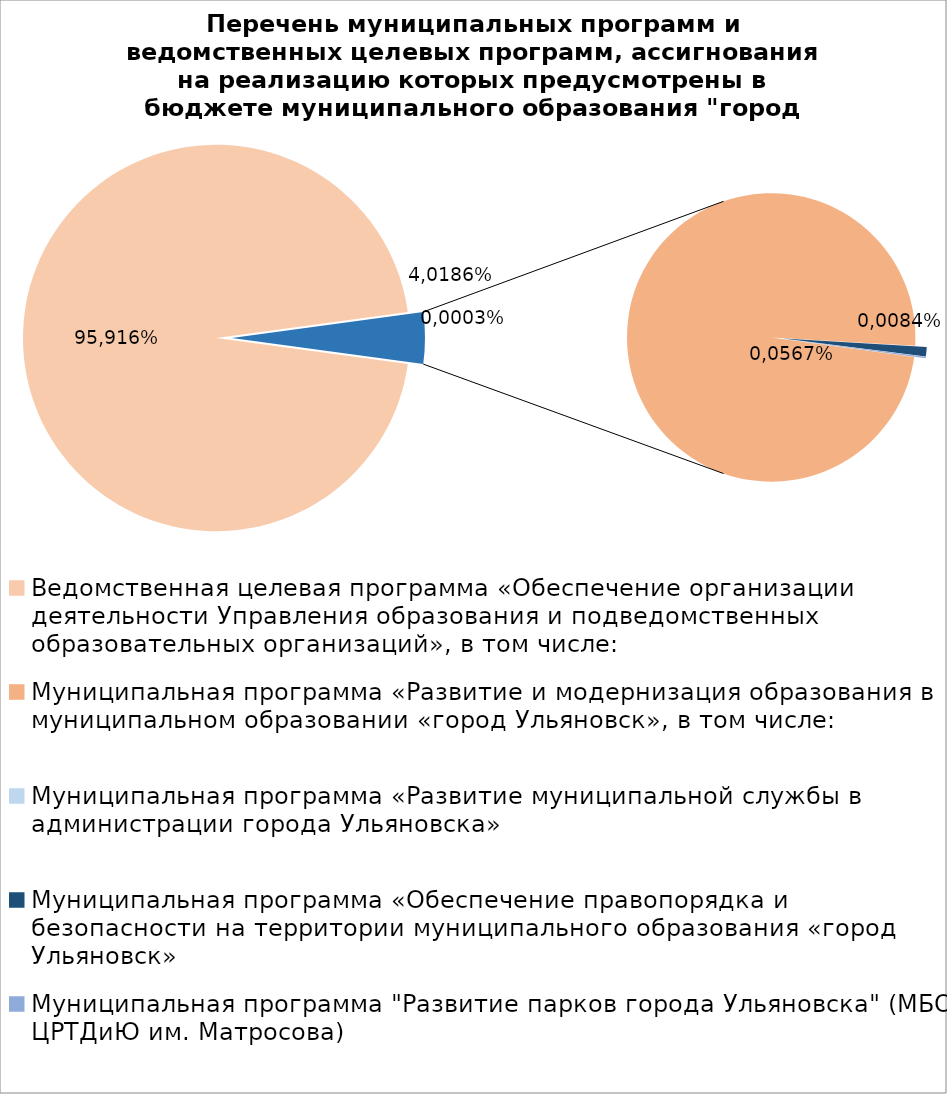
| Category | Series 0 |
|---|---|
| Ведомственная целевая программа «Обеспечение организации деятельности Управления образования и подведомственных образовательных организаций», в том числе: | 5622012.51 |
| Муниципальная программа «Развитие и модернизация образования в муниципальном образовании «город Ульяновск», в том числе: | 250104.57 |
| Муниципальная программа «Развитие муниципальной службы в администрации города Ульяновска» | 15.4 |
| Муниципальная программа «Обеспечение правопорядка и безопасности на территории муниципального образования «город Ульяновск» | 2700 |
| Муниципальная программа "Развитие парков города Ульяновска" (МБОУ ЦРТДиЮ им. Матросова) | 400 |